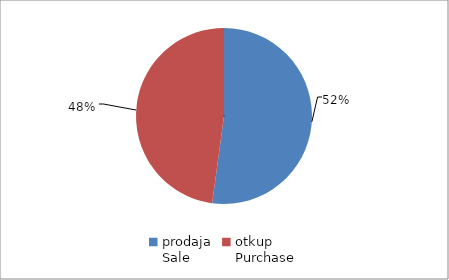
| Category | Series 0 |
|---|---|
| prodaja
Sale | 153723636 |
| otkup
Purchase | 141039500.78 |